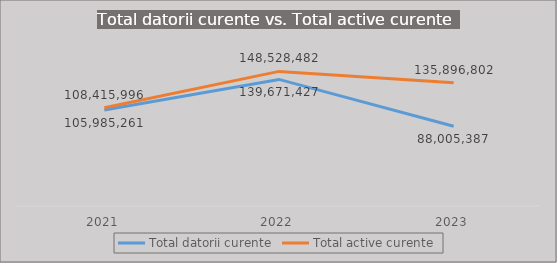
| Category | Total datorii curente | Total active curente |
|---|---|---|
| 2021.0 | 105985260.952 | 108415996.085 |
| 2022.0 | 139671426.922 | 148528481.681 |
| 2023.0 | 88005387.102 | 135896802.133 |